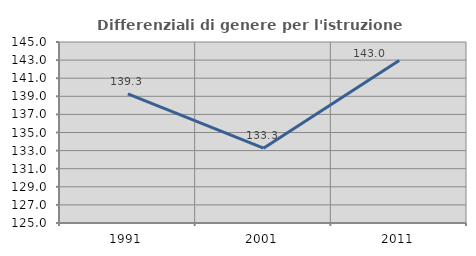
| Category | Differenziali di genere per l'istruzione superiore |
|---|---|
| 1991.0 | 139.265 |
| 2001.0 | 133.268 |
| 2011.0 | 142.967 |